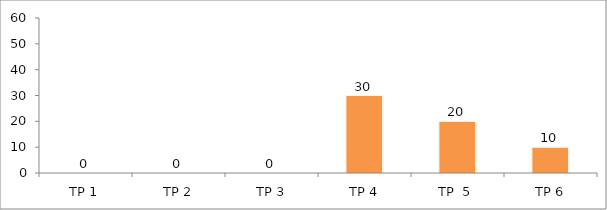
| Category | BIL. MURID |
|---|---|
| TP 1 | 0 |
| TP 2 | 0 |
|  TP 3 | 0 |
| TP 4 | 30 |
| TP  5 | 20 |
| TP 6 | 10 |